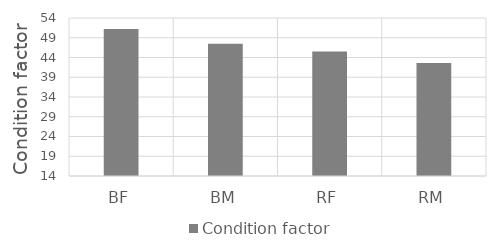
| Category | Condition factor |
|---|---|
| BF | 51.2 |
| BM | 47.5 |
| RF | 45.5 |
| RM | 42.6 |